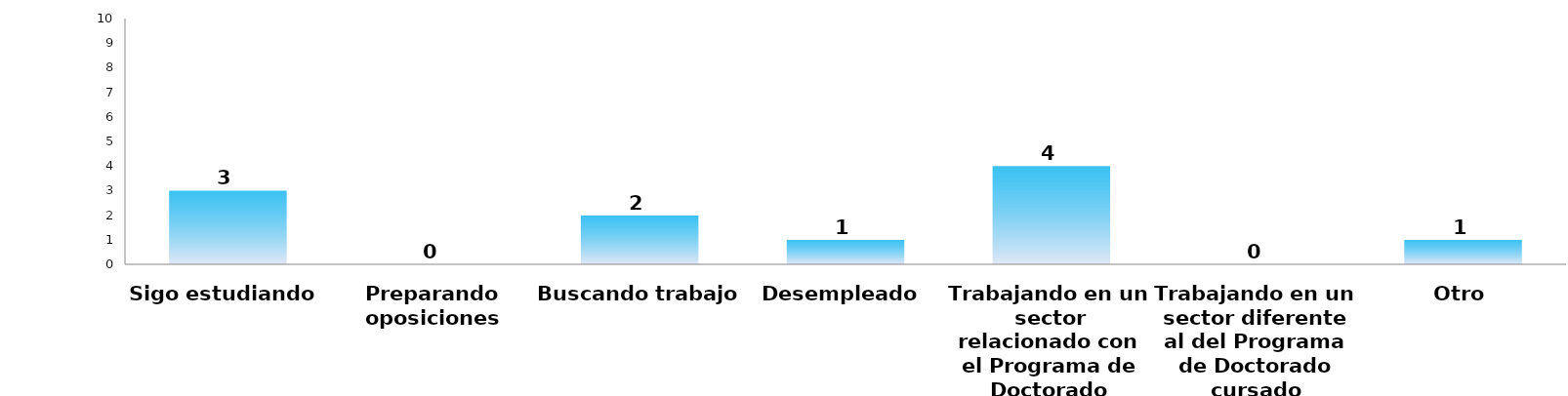
| Category | Series 0 |
|---|---|
| Sigo estudiando | 3 |
| Preparando oposiciones | 0 |
| Buscando trabajo | 2 |
| Desempleado | 1 |
| Trabajando en un sector relacionado con el Programa de Doctorado cursado | 4 |
| Trabajando en un sector diferente al del Programa de Doctorado cursado | 0 |
| Otro | 1 |